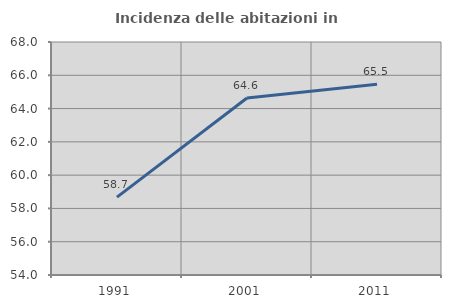
| Category | Incidenza delle abitazioni in proprietà  |
|---|---|
| 1991.0 | 58.681 |
| 2001.0 | 64.639 |
| 2011.0 | 65.463 |